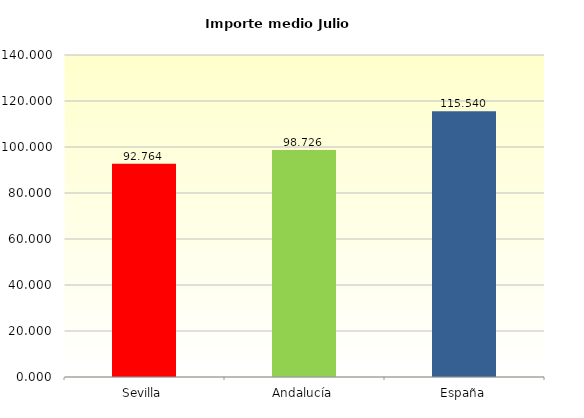
| Category | Series 2 |
|---|---|
| Sevilla | 92.764 |
| Andalucía | 98.726 |
| España | 115.54 |